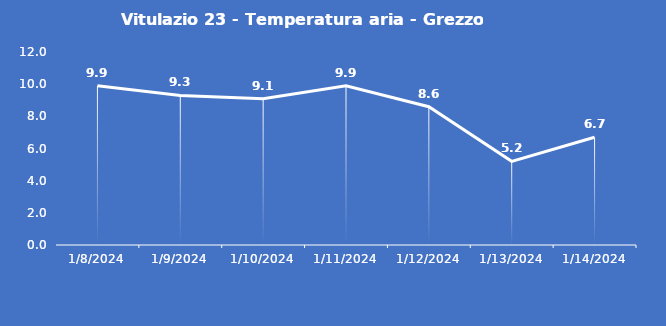
| Category | Vitulazio 23 - Temperatura aria - Grezzo (°C) |
|---|---|
| 1/8/24 | 9.9 |
| 1/9/24 | 9.3 |
| 1/10/24 | 9.1 |
| 1/11/24 | 9.9 |
| 1/12/24 | 8.6 |
| 1/13/24 | 5.2 |
| 1/14/24 | 6.7 |